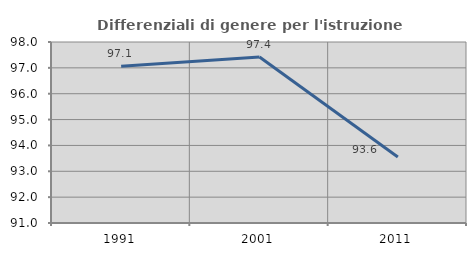
| Category | Differenziali di genere per l'istruzione superiore |
|---|---|
| 1991.0 | 97.064 |
| 2001.0 | 97.419 |
| 2011.0 | 93.553 |